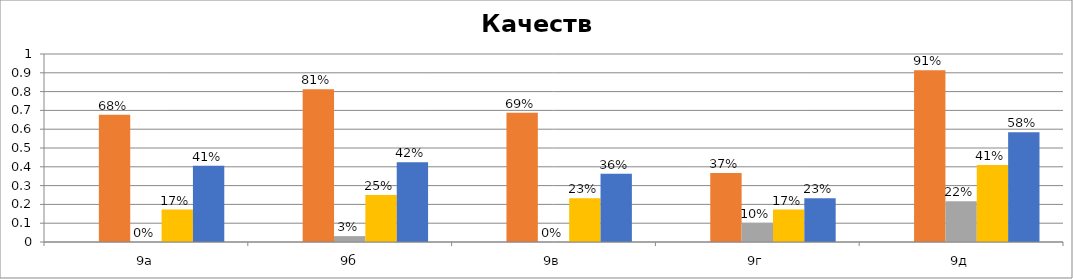
| Category | Series 0 | Series 1 | Series 2 | Series 3 | Series 4 |
|---|---|---|---|---|---|
| 9а |  | 0.677 | 0 | 0.172 | 0.406 |
| 9б |  | 0.812 | 0.031 | 0.25 | 0.424 |
| 9в |  | 0.688 | 0 | 0.233 | 0.364 |
| 9г |  | 0.367 | 0.1 | 0.172 | 0.233 |
| 9д |  | 0.913 | 0.217 | 0.409 | 0.583 |